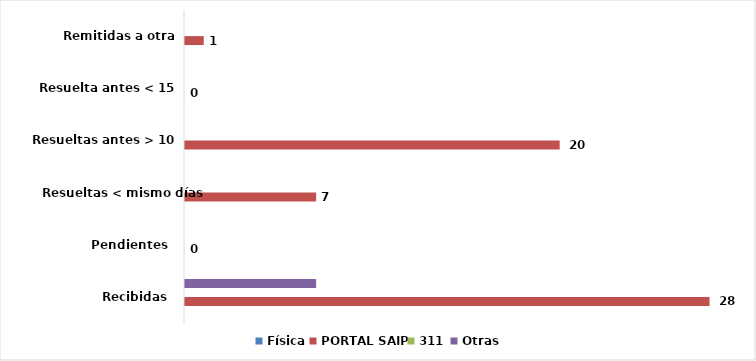
| Category | Física | PORTAL SAIP | 311 | Otras |
|---|---|---|---|---|
| Recibidas  | 0 | 28 | 0 | 7 |
| Pendientes  | 0 | 0 | 0 | 0 |
| Resueltas < mismo días | 0 | 7 | 0 | 0 |
| Resueltas antes > 10 días  | 0 | 20 | 0 | 0 |
| Resuelta antes < 15 días | 0 | 0 | 0 | 0 |
| Remitidas a otra entidad | 0 | 1 | 0 | 0 |